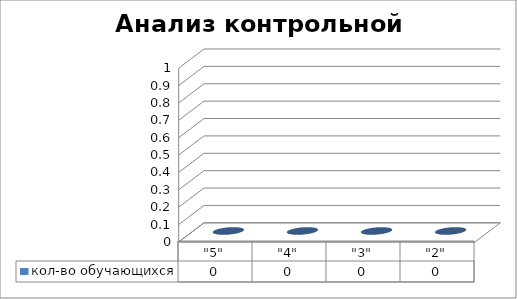
| Category | кол-во обучающихся |
|---|---|
| "5" | 0 |
| "4" | 0 |
| "3" | 0 |
| "2" | 0 |